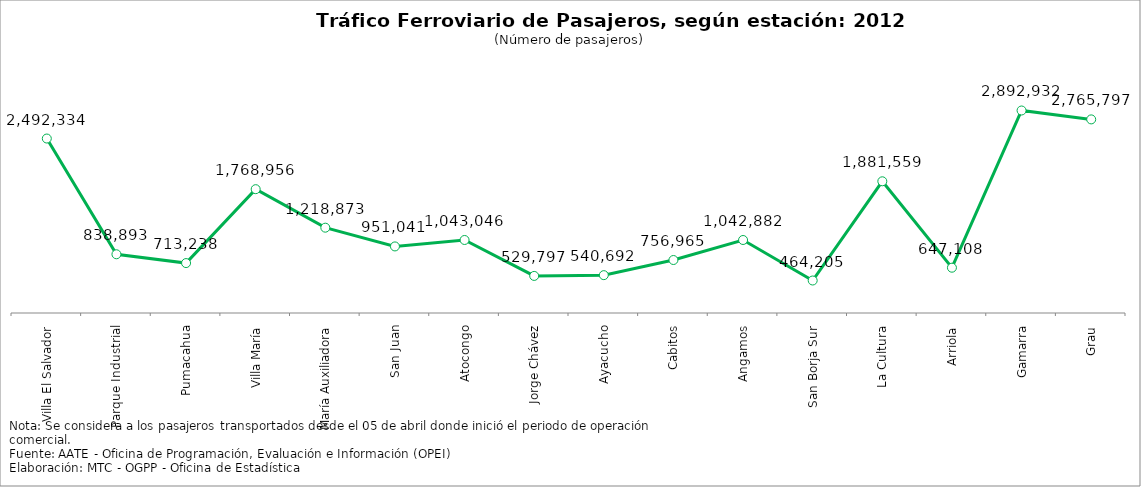
| Category | Series 0 |
|---|---|
| Villa El Salvador | 2492334 |
| Parque Industrial | 838893 |
| Pumacahua | 713238 |
| Villa María | 1768956 |
| María Auxiliadora | 1218873 |
| San Juan | 951041 |
| Atocongo | 1043046 |
| Jorge Chávez | 529797 |
| Ayacucho | 540692 |
| Cabitos | 756965 |
| Angamos | 1042882 |
| San Borja Sur | 464205 |
| La Cultura | 1881559 |
| Arriola | 647108 |
| Gamarra | 2892932 |
| Grau | 2765797 |